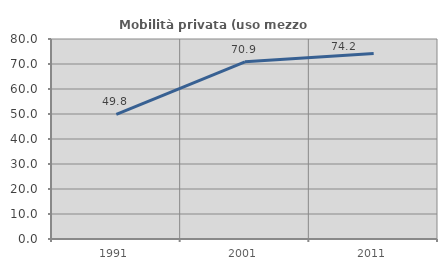
| Category | Mobilità privata (uso mezzo privato) |
|---|---|
| 1991.0 | 49.835 |
| 2001.0 | 70.873 |
| 2011.0 | 74.188 |